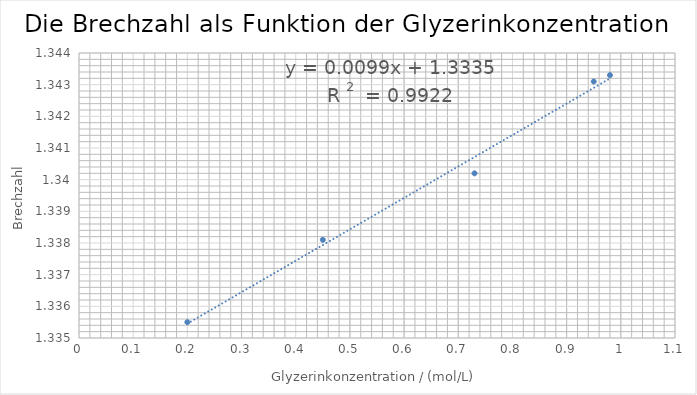
| Category | Brechzahl |
|---|---|
| 0.2 | 1.336 |
| 0.45 | 1.338 |
| 0.73 | 1.34 |
| 0.95 | 1.343 |
| 0.98 | 1.343 |